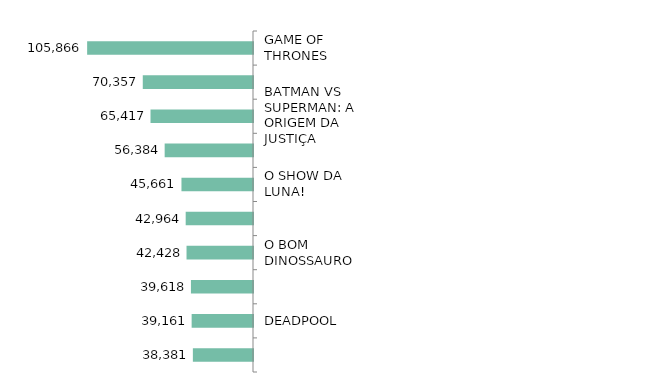
| Category | Series 0 |
|---|---|
| GAME OF THRONES | 105866 |
| PROCURANDO DORY | 70357 |
| BATMAN VS SUPERMAN: A ORIGEM DA JUSTIÇA | 65417 |
| GALINHA PINTADINHA - 10 ANOS | 56384 |
| O SHOW DA LUNA! | 45661 |
| PETS - A VIDA SECRETA DOS BICHOS | 42964 |
| O BOM DINOSSAURO | 42428 |
| ANGRY BIRDS - O FILME | 39618 |
| DEADPOOL | 39161 |
| ESQUADRÃO SUICIDA | 38381 |